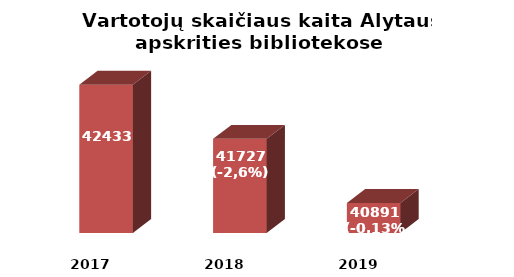
| Category | Series 0 |
|---|---|
| 2017.0 | 42433 |
| 2018.0 | 41727 |
| 2019.0 | 40891 |